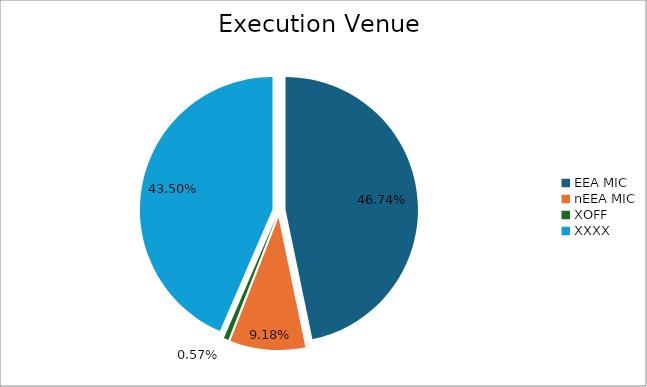
| Category | Series 0 |
|---|---|
| EEA MIC | 6566783.891 |
| nEEA MIC | 1290281.247 |
| XOFF | 80426.245 |
| XXXX | 6112024.567 |